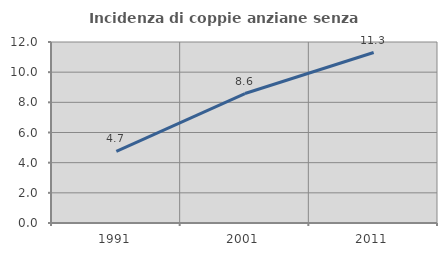
| Category | Incidenza di coppie anziane senza figli  |
|---|---|
| 1991.0 | 4.741 |
| 2001.0 | 8.582 |
| 2011.0 | 11.301 |